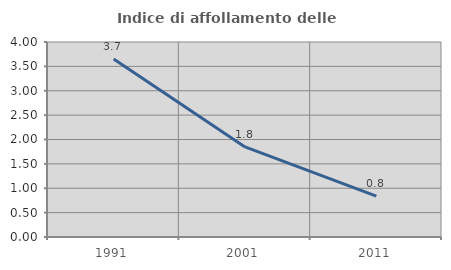
| Category | Indice di affollamento delle abitazioni  |
|---|---|
| 1991.0 | 3.65 |
| 2001.0 | 1.847 |
| 2011.0 | 0.837 |